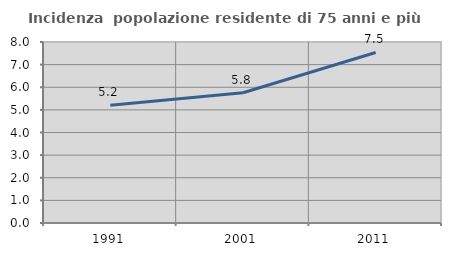
| Category | Incidenza  popolazione residente di 75 anni e più |
|---|---|
| 1991.0 | 5.206 |
| 2001.0 | 5.757 |
| 2011.0 | 7.536 |